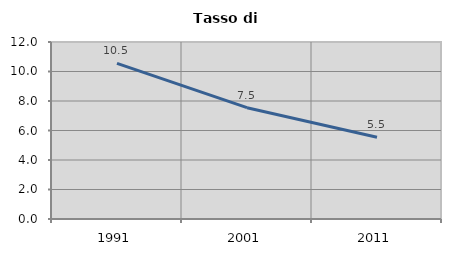
| Category | Tasso di disoccupazione   |
|---|---|
| 1991.0 | 10.549 |
| 2001.0 | 7.547 |
| 2011.0 | 5.537 |